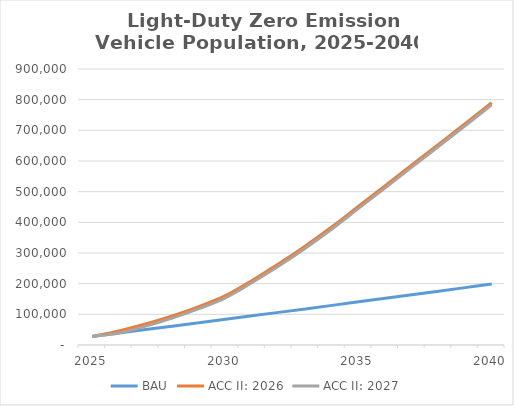
| Category | BAU | ACC II: 2026 | ACC II: 2027 |
|---|---|---|---|
| 2025.0 | 28054.611 | 28054.611 | 28054.611 |
| 2026.0 | 39152.253 | 46120.54 | 39152.253 |
| 2027.0 | 50273.256 | 68362.546 | 61394.259 |
| 2028.0 | 61417.542 | 94797.828 | 87829.541 |
| 2029.0 | 72585.031 | 125443.497 | 118475.21 |
| 2030.0 | 83775.645 | 160837.067 | 153868.781 |
| 2031.0 | 95030.313 | 210566.993 | 203598.707 |
| 2032.0 | 106349.908 | 264532.504 | 257564.218 |
| 2033.0 | 117735.305 | 322783.372 | 315815.085 |
| 2034.0 | 129187.377 | 385370.281 | 378401.994 |
| 2035.0 | 140707.001 | 452344.835 | 445376.548 |
| 2036.0 | 152257.042 | 519496.239 | 512527.952 |
| 2037.0 | 163837.502 | 586824.495 | 579856.208 |
| 2038.0 | 175448.381 | 654329.602 | 647361.316 |
| 2039.0 | 187089.677 | 722011.561 | 715043.274 |
| 2040.0 | 198761.393 | 789870.371 | 782902.084 |